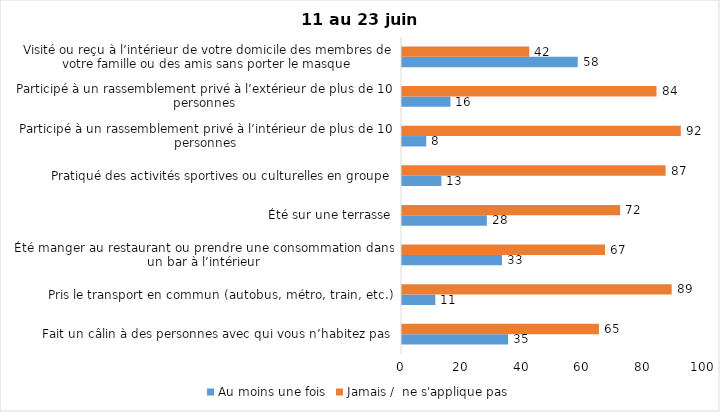
| Category | Au moins une fois | Jamais /  ne s'applique pas |
|---|---|---|
| Fait un câlin à des personnes avec qui vous n’habitez pas | 35 | 65 |
| Pris le transport en commun (autobus, métro, train, etc.) | 11 | 89 |
| Été manger au restaurant ou prendre une consommation dans un bar à l’intérieur | 33 | 67 |
| Été sur une terrasse | 28 | 72 |
| Pratiqué des activités sportives ou culturelles en groupe | 13 | 87 |
| Participé à un rassemblement privé à l’intérieur de plus de 10 personnes | 8 | 92 |
| Participé à un rassemblement privé à l’extérieur de plus de 10 personnes | 16 | 84 |
| Visité ou reçu à l’intérieur de votre domicile des membres de votre famille ou des amis sans porter le masque | 58 | 42 |